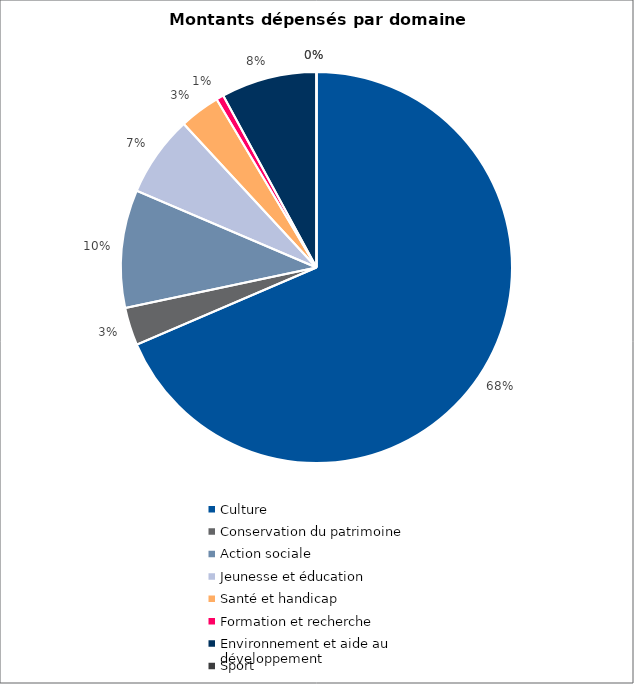
| Category | Series 0 |
|---|---|
| Culture | 7218180 |
| Conservation du patrimoine | 330000 |
| Action sociale | 1025300 |
| Jeunesse et éducation | 705800 |
| Santé et handicap | 352800 |
| Formation et recherche | 65000 |
| Environnement et aide au
développement | 832900 |
| Sport | 0 |
| Autres projets d’utilité publique | 0 |